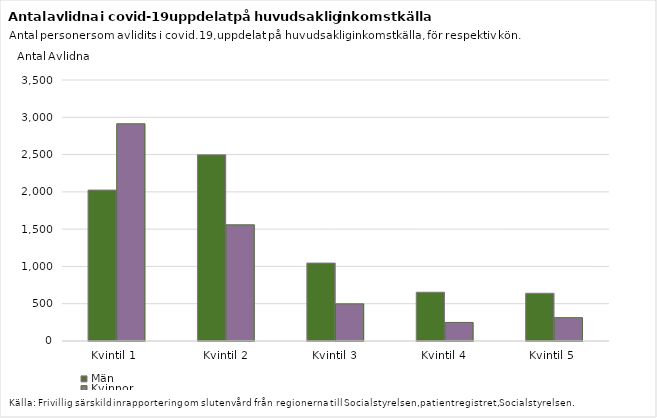
| Category | Män | Kvinnor |
|---|---|---|
| Kvintil 1  | 2024 | 2913 |
| Kvintil 2 | 2496 | 1558 |
| Kvintil 3 | 1045 | 498 |
| Kvintil 4 | 654 | 249 |
| Kvintil 5  | 640 | 313 |